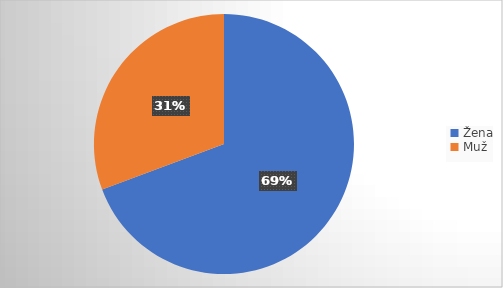
| Category | Series 0 |
|---|---|
| Žena | 113 |
| Muž | 50 |